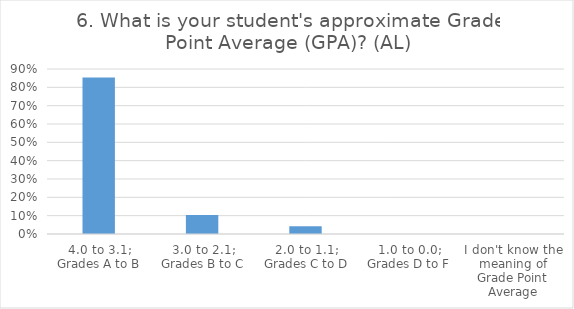
| Category | 6. What is your student's approximate Grade Point Average (GPA)? (AL) |
|---|---|
| 4.0 to 3.1; Grades A to B | 0.854 |
| 3.0 to 2.1; Grades B to C | 0.104 |
| 2.0 to 1.1; Grades C to D | 0.042 |
| 1.0 to 0.0; Grades D to F | 0 |
| I don't know the meaning of Grade Point Average | 0 |